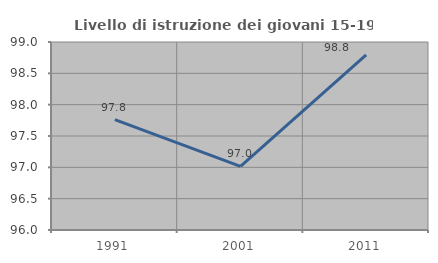
| Category | Livello di istruzione dei giovani 15-19 anni |
|---|---|
| 1991.0 | 97.761 |
| 2001.0 | 97.015 |
| 2011.0 | 98.795 |